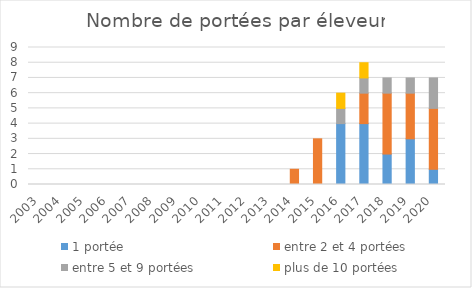
| Category | 1 portée | entre 2 et 4 portées | entre 5 et 9 portées | plus de 10 portées |
|---|---|---|---|---|
| 2003.0 | 0 | 0 | 0 | 0 |
| 2004.0 | 0 | 0 | 0 | 0 |
| 2005.0 | 0 | 0 | 0 | 0 |
| 2006.0 | 0 | 0 | 0 | 0 |
| 2007.0 | 0 | 0 | 0 | 0 |
| 2008.0 | 0 | 0 | 0 | 0 |
| 2009.0 | 0 | 0 | 0 | 0 |
| 2010.0 | 0 | 0 | 0 | 0 |
| 2011.0 | 0 | 0 | 0 | 0 |
| 2012.0 | 0 | 0 | 0 | 0 |
| 2013.0 | 0 | 0 | 0 | 0 |
| 2014.0 | 0 | 1 | 0 | 0 |
| 2015.0 | 0 | 3 | 0 | 0 |
| 2016.0 | 4 | 0 | 1 | 1 |
| 2017.0 | 4 | 2 | 1 | 1 |
| 2018.0 | 2 | 4 | 1 | 0 |
| 2019.0 | 3 | 3 | 1 | 0 |
| 2020.0 | 1 | 4 | 2 | 0 |